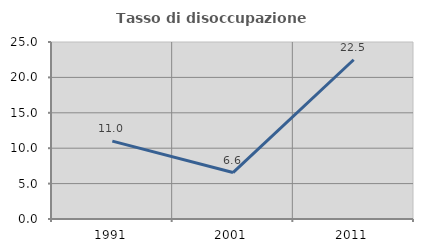
| Category | Tasso di disoccupazione giovanile  |
|---|---|
| 1991.0 | 11 |
| 2001.0 | 6.56 |
| 2011.0 | 22.495 |